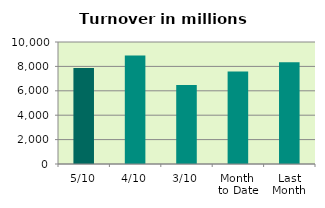
| Category | Series 0 |
|---|---|
| 5/10 | 7879.017 |
| 4/10 | 8891.576 |
| 3/10 | 6485.653 |
| Month 
to Date | 7582.882 |
| Last
Month | 8346.546 |